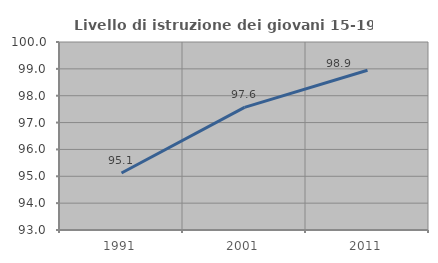
| Category | Livello di istruzione dei giovani 15-19 anni |
|---|---|
| 1991.0 | 95.12 |
| 2001.0 | 97.567 |
| 2011.0 | 98.95 |